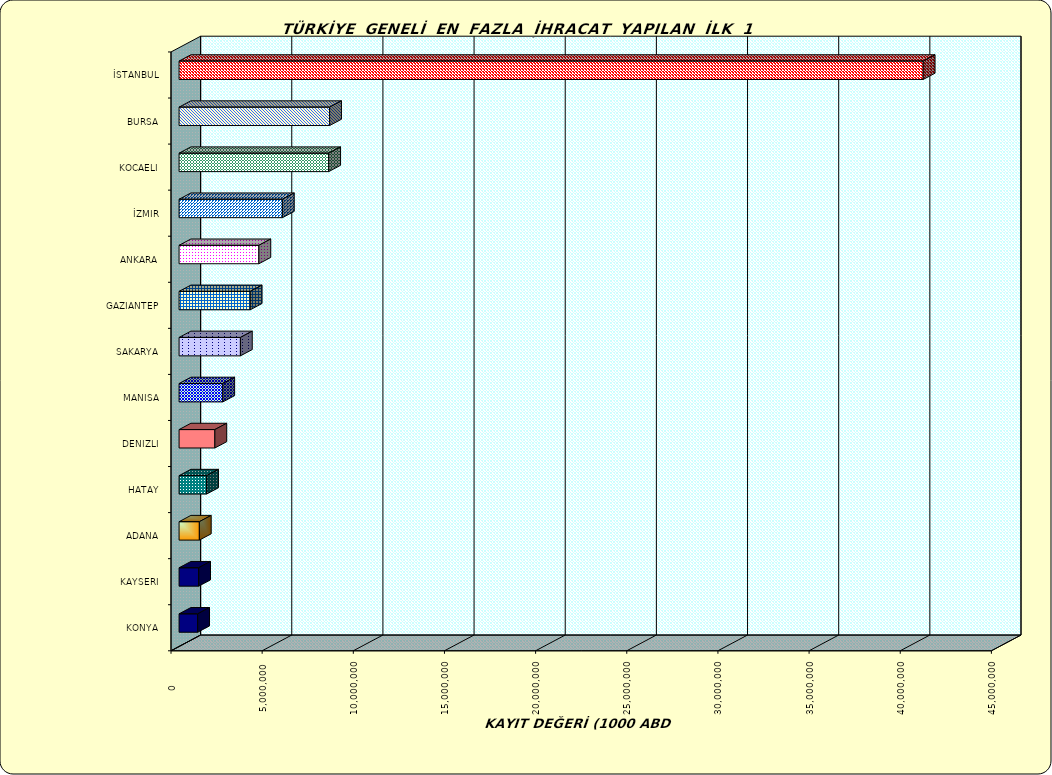
| Category | Series 0 |
|---|---|
| İSTANBUL | 40817091.663 |
| BURSA | 8257344.374 |
| KOCAELI | 8207583.722 |
| İZMIR | 5667219.293 |
| ANKARA | 4378384.452 |
| GAZIANTEP | 3902493.747 |
| SAKARYA | 3364444.12 |
| MANISA | 2396989.749 |
| DENIZLI | 1962912.383 |
| HATAY | 1509926.21 |
| ADANA | 1112448.894 |
| KAYSERI | 1074039.672 |
| KONYA | 1020635.592 |